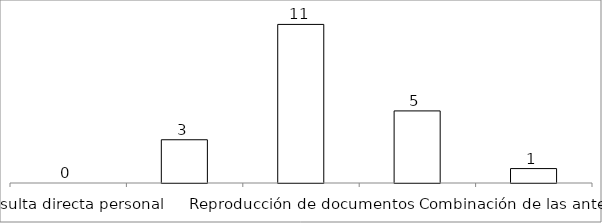
| Category | Series 0 |
|---|---|
| Consulta directa personal | 0 |
| Consulta directa electrónica | 3 |
| Reproducción de documentos | 11 |
| Elaboración de informes | 5 |
| Combinación de las anteriores | 1 |